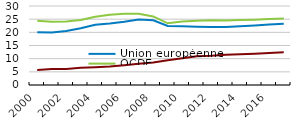
| Category | Union européenne | OCDE | BRIIC |
|---|---|---|---|
| 2000.0 | 20.064 | 24.419 | 5.722 |
| 2001.0 | 19.91 | 23.988 | 6.05 |
| 2002.0 | 20.525 | 24.078 | 6.086 |
| 2003.0 | 21.562 | 24.667 | 6.53 |
| 2004.0 | 22.845 | 25.95 | 6.784 |
| 2005.0 | 23.376 | 26.685 | 7.04 |
| 2006.0 | 24.047 | 27.048 | 7.491 |
| 2007.0 | 24.914 | 27.09 | 8.049 |
| 2008.0 | 24.601 | 26.041 | 8.508 |
| 2009.0 | 22.424 | 23.424 | 9.438 |
| 2010.0 | 22.311 | 24.105 | 10.2 |
| 2011.0 | 22.1 | 24.4 | 10.92 |
| 2012.0 | 21.992 | 24.542 | 11.108 |
| 2013.0 | 22.037 | 24.54 | 11.521 |
| 2014.0 | 22.3 | 24.64 | 11.632 |
| 2015.0 | 22.625 | 24.791 | 11.86 |
| 2016.0 | 22.96 | 25.021 | 12.16 |
| 2017.0 | 23.299 | 25.255 | 12.458 |